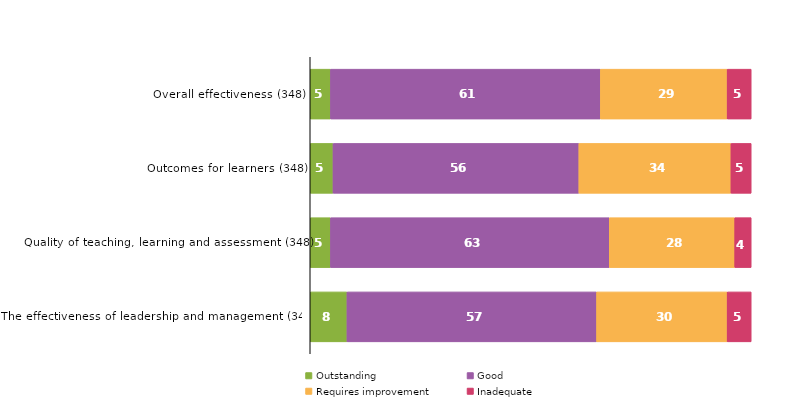
| Category | Outstanding | Good | Requires improvement | Inadequate |
|---|---|---|---|---|
| Overall effectiveness (348) | 4.598 | 61.207 | 28.736 | 5.46 |
| Outcomes for learners (348) | 5.172 | 55.747 | 34.483 | 4.598 |
| Quality of teaching, learning and assessment (348) | 4.598 | 63.218 | 28.448 | 3.736 |
| The effectiveness of leadership and management (348) | 8.333 | 56.609 | 29.598 | 5.46 |